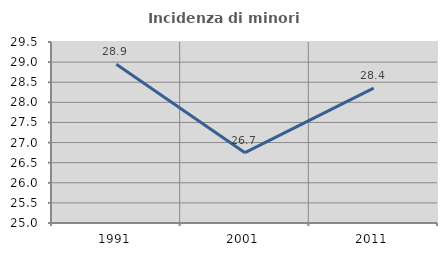
| Category | Incidenza di minori stranieri |
|---|---|
| 1991.0 | 28.947 |
| 2001.0 | 26.749 |
| 2011.0 | 28.353 |